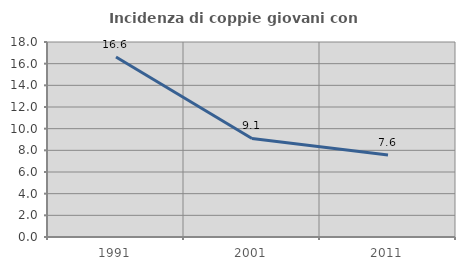
| Category | Incidenza di coppie giovani con figli |
|---|---|
| 1991.0 | 16.622 |
| 2001.0 | 9.097 |
| 2011.0 | 7.571 |